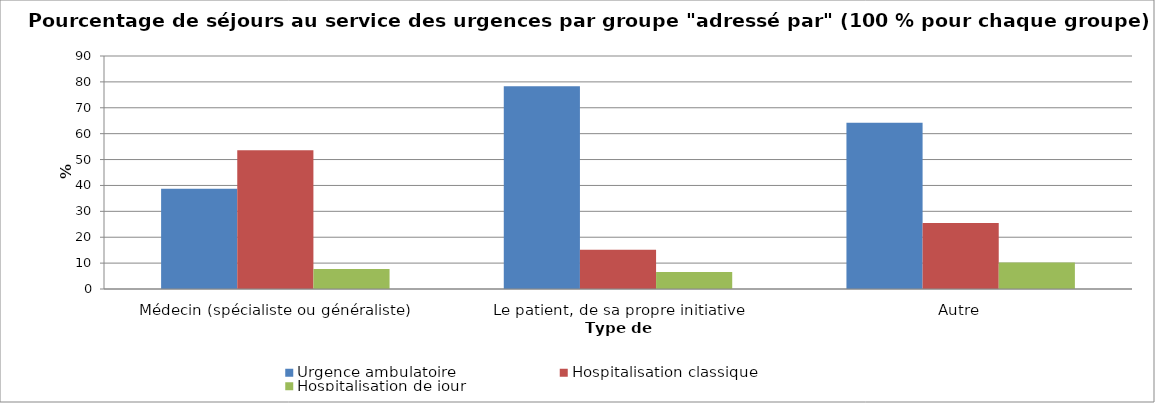
| Category | Urgence ambulatoire | Hospitalisation classique | Hospitalisation de jour |
|---|---|---|---|
| Médecin (spécialiste ou généraliste) | 38.74 | 53.58 | 7.68 |
| Le patient, de sa propre initiative | 78.29 | 15.13 | 6.58 |
| Autre | 64.22 | 25.53 | 10.25 |